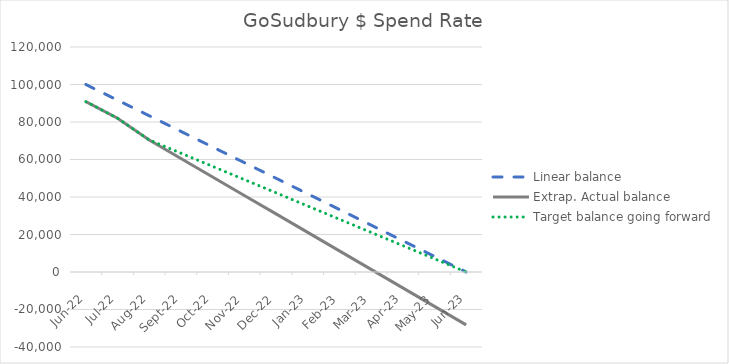
| Category | Linear balance | Extrap. Actual balance | Target balance going forward |
|---|---|---|---|
| 2022-06-01 | 100000 | 90864 | 90864 |
| 2022-07-01 | 91666.667 | 81995.28 | 81995.28 |
| 2022-08-01 | 83333.333 | 70420.64 | 70420.64 |
| 2022-09-01 | 75000 | 60560.853 | 63378.64 |
| 2022-10-01 | 66666.667 | 50701.067 | 56336.64 |
| 2022-11-01 | 58333.333 | 40841.28 | 49294.64 |
| 2022-12-01 | 50000 | 30981.493 | 42252.64 |
| 2023-01-01 | 41666.667 | 21121.707 | 35210.64 |
| 2023-02-01 | 33333.333 | 11261.92 | 28168.64 |
| 2023-03-01 | 25000 | 1402.133 | 21126.64 |
| 2023-04-01 | 16666.667 | -8457.653 | 14084.64 |
| 2023-05-01 | 8333.333 | -18317.44 | 7042.64 |
| 2023-06-01 | 0 | -28177.227 | 0.64 |